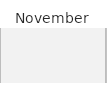
| Category | 1 | Fill 1 | 2 | Fill 2 | 3 | Fill 3 | 4 | Fill 4 | 5 | Fill 5 | 6 | Fill 6 | 7 | Fill 7 | 8 | Fill 8 | 9 | Fill 9 | 10 | Fill 10 | 11 | Fill 11 | 12 | Fill 12 | 13 | Fill 13 | 14 | Fill 14 | 15 | Fill 15 | 16 | Fill 16 | 17 | Fill 17 | 18 | Fill 18 | 19 | Fill 19 | 20 | Fill 20 | 21 | Fill 21 | 22 | Fill 22 | 23 | Fill 23 | 24 | Fill 24 | 25 | Fill 25 | 26 | Fill 26 | 27 | Fill 27 | 28 | Fill 28 | 29 | Fill 29 | 30 | Fill 30 |
|---|---|---|---|---|---|---|---|---|---|---|---|---|---|---|---|---|---|---|---|---|---|---|---|---|---|---|---|---|---|---|---|---|---|---|---|---|---|---|---|---|---|---|---|---|---|---|---|---|---|---|---|---|---|---|---|---|---|---|---|---|
| STSH | 0 | 1 | 0 | 1 | 0 | 1 | 0 | 1 | 0 | 1 | 0 | 1 | 0 | 1 | 0 | 1 | 0 | 1 | 0 | 1 | 0 | 1 | 0 | 1 | 0 | 1 | 0 | 1 | 0 | 1 | 0 | 1 | 0 | 1 | 0 | 1 | 0 | 1 | 0 | 1 | 0 | 1 | 0 | 1 | 0 | 1 | 0 | 1 | 0 | 1 | 0 | 1 | 0 | 1 | 0 | 1 | 0 | 1 | 0 | 1 |